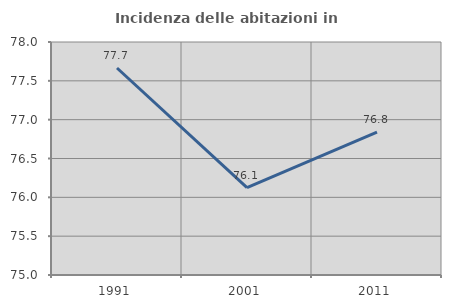
| Category | Incidenza delle abitazioni in proprietà  |
|---|---|
| 1991.0 | 77.665 |
| 2001.0 | 76.125 |
| 2011.0 | 76.839 |